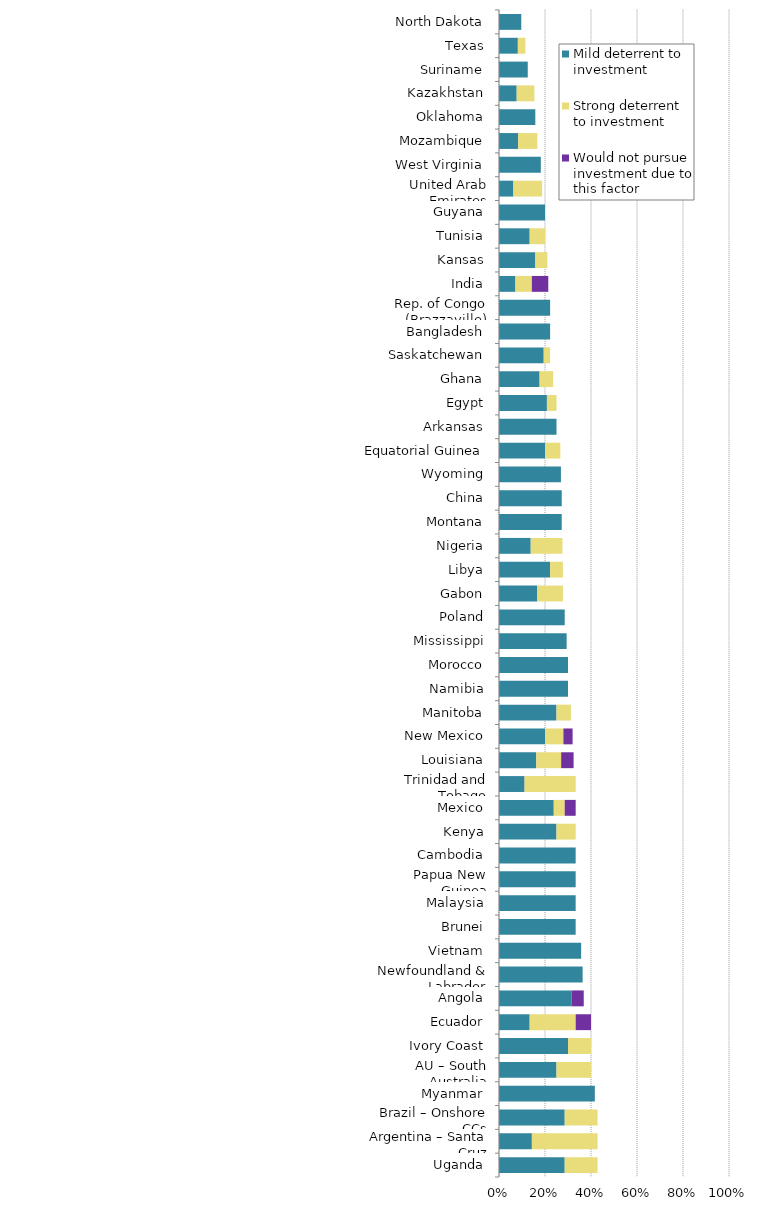
| Category | Mild deterrent to investment | Strong deterrent to investment | Would not pursue investment due to this factor |
|---|---|---|---|
| Uganda | 0.286 | 0.143 | 0 |
| Argentina – Santa Cruz | 0.143 | 0.286 | 0 |
| Brazil – Onshore CCs | 0.286 | 0.143 | 0 |
| Myanmar | 0.417 | 0 | 0 |
| AU – South Australia | 0.25 | 0.15 | 0 |
| Ivory Coast | 0.3 | 0.1 | 0 |
| Ecuador | 0.133 | 0.2 | 0.067 |
| Angola | 0.316 | 0 | 0.053 |
| Newfoundland & Labrador | 0.364 | 0 | 0 |
| Vietnam | 0.357 | 0 | 0 |
| Brunei | 0.333 | 0 | 0 |
| Malaysia | 0.333 | 0 | 0 |
| Papua New Guinea | 0.333 | 0 | 0 |
| Cambodia | 0.333 | 0 | 0 |
| Kenya | 0.25 | 0.083 | 0 |
| Mexico | 0.238 | 0.048 | 0.048 |
| Trinidad and Tobago | 0.111 | 0.222 | 0 |
| Louisiana | 0.162 | 0.108 | 0.054 |
| New Mexico | 0.2 | 0.08 | 0.04 |
| Manitoba | 0.25 | 0.062 | 0 |
| Namibia | 0.3 | 0 | 0 |
| Morocco | 0.3 | 0 | 0 |
| Mississippi | 0.294 | 0 | 0 |
| Poland | 0.286 | 0 | 0 |
| Gabon | 0.167 | 0.111 | 0 |
| Libya | 0.222 | 0.056 | 0 |
| Nigeria | 0.138 | 0.138 | 0 |
| Montana | 0.273 | 0 | 0 |
| China | 0.273 | 0 | 0 |
| Wyoming | 0.269 | 0 | 0 |
| Equatorial Guinea | 0.2 | 0.067 | 0 |
| Arkansas | 0.25 | 0 | 0 |
| Egypt | 0.208 | 0.042 | 0 |
| Ghana | 0.176 | 0.059 | 0 |
| Saskatchewan | 0.194 | 0.028 | 0 |
| Bangladesh | 0.222 | 0 | 0 |
| Rep. of Congo (Brazzaville) | 0.222 | 0 | 0 |
| India | 0.071 | 0.071 | 0.071 |
| Kansas | 0.158 | 0.053 | 0 |
| Tunisia | 0.133 | 0.067 | 0 |
| Guyana | 0.2 | 0 | 0 |
| United Arab Emirates | 0.062 | 0.125 | 0 |
| West Virginia | 0.182 | 0 | 0 |
| Mozambique | 0.083 | 0.083 | 0 |
| Oklahoma | 0.158 | 0 | 0 |
| Kazakhstan | 0.077 | 0.077 | 0 |
| Suriname | 0.125 | 0 | 0 |
| Texas | 0.082 | 0.033 | 0 |
| North Dakota | 0.097 | 0 | 0 |